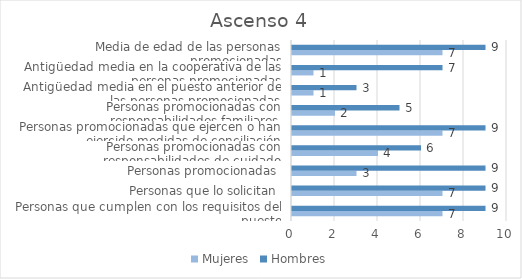
| Category | Mujeres | Hombres |
|---|---|---|
| Personas que cumplen con los requisitos del puesto | 7 | 9 |
| Personas que lo solicitan | 7 | 9 |
| Personas promocionadas | 3 | 9 |
| Personas promocionadas con responsabilidades de cuidado | 4 | 6 |
| Personas promocionadas que ejercen o han ejercido medidas de conciliación | 7 | 9 |
| Personas promocionadas con responsabilidades familiares | 2 | 5 |
| Antigüedad media en el puesto anterior de las personas promocionadas | 1 | 3 |
| Antigüedad media en la cooperativa de las personas promocionadas | 1 | 7 |
| Media de edad de las personas promocionadas | 7 | 9 |